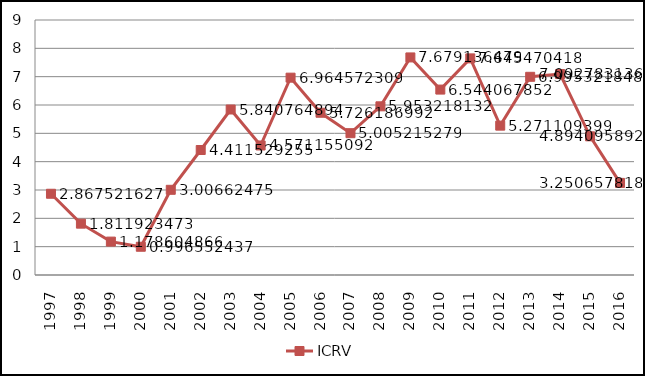
| Category | ICRV |
|---|---|
| 1997.0 | 2.868 |
| 1998.0 | 1.812 |
| 1999.0 | 1.179 |
| 2000.0 | 0.997 |
| 2001.0 | 3.007 |
| 2002.0 | 4.412 |
| 2003.0 | 5.841 |
| 2004.0 | 4.571 |
| 2005.0 | 6.965 |
| 2006.0 | 5.726 |
| 2007.0 | 5.005 |
| 2008.0 | 5.953 |
| 2009.0 | 7.679 |
| 2010.0 | 6.544 |
| 2011.0 | 7.645 |
| 2012.0 | 5.271 |
| 2013.0 | 6.995 |
| 2014.0 | 7.093 |
| 2015.0 | 4.894 |
| 2016.0 | 3.251 |